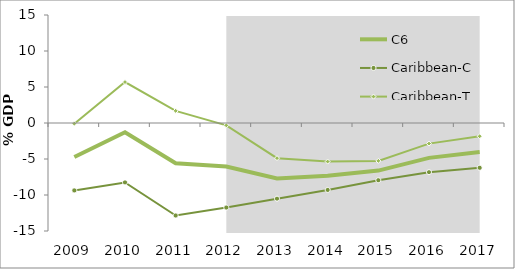
| Category | C6 | Caribbean-C | Caribbean-T |
|---|---|---|---|
| 2009.0 | -4.729 | -9.366 | -0.093 |
| 2010.0 | -1.283 | -8.255 | 5.689 |
| 2011.0 | -5.58 | -12.846 | 1.686 |
| 2012.0 | -6.033 | -11.741 | -0.326 |
| 2013.0 | -7.694 | -10.506 | -4.882 |
| 2014.0 | -7.327 | -9.296 | -5.358 |
| 2015.0 | -6.607 | -7.949 | -5.264 |
| 2016.0 | -4.845 | -6.83 | -2.861 |
| 2017.0 | -4.03 | -6.22 | -1.84 |